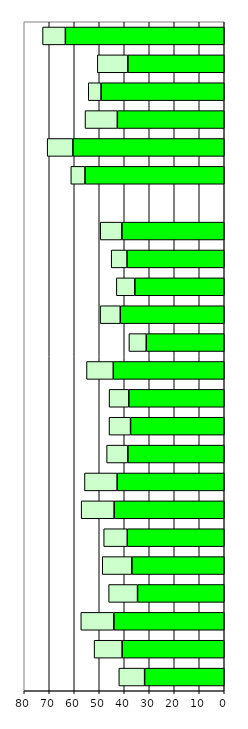
| Category | Series 0 | Series 1 |
|---|---|---|
| 0 | 31.847 | 10.32 |
| 1 | 40.852 | 11.206 |
| 2 | 44.146 | 13.231 |
| 3 | 34.677 | 11.559 |
| 4 | 36.951 | 11.847 |
| 5 | 38.793 | 9.431 |
| 6 | 44.053 | 13.179 |
| 7 | 42.854 | 13.058 |
| 8 | 38.551 | 8.497 |
| 9 | 37.47 | 8.614 |
| 10 | 38.169 | 7.899 |
| 11 | 44.382 | 10.707 |
| 12 | 31.196 | 6.933 |
| 13 | 41.589 | 8.065 |
| 14 | 35.765 | 7.397 |
| 15 | 38.892 | 6.323 |
| 16 | 40.944 | 8.667 |
| 17 | 0 | 0 |
| 18 | 55.7 | 5.664 |
| 19 | 60.532 | 10.293 |
| 20 | 42.773 | 12.918 |
| 21 | 49.279 | 5.116 |
| 22 | 38.555 | 12.214 |
| 23 | 63.547 | 9.125 |